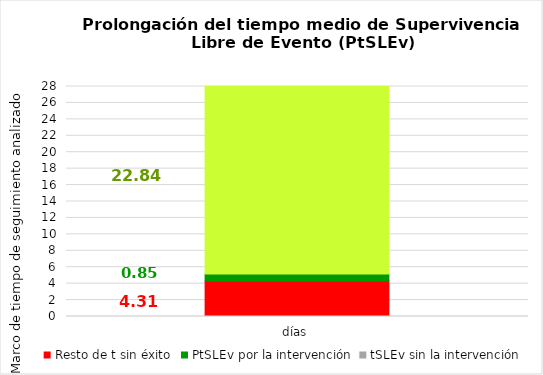
| Category | Resto de t sin éxito | PtSLEv por la intervención | tSLEv sin la intervención |
|---|---|---|---|
| días | 4.313 | 0.846 | 22.841 |